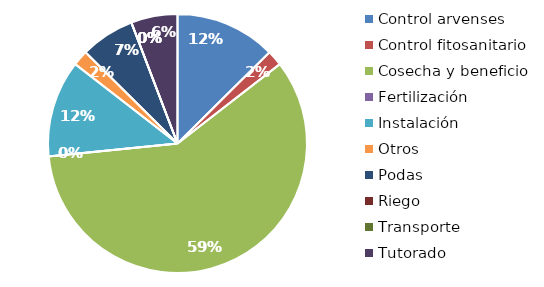
| Category | Valor |
|---|---|
| Control arvenses | 1040000 |
| Control fitosanitario | 160000 |
| Cosecha y beneficio | 4875000 |
| Fertilización | 0 |
| Instalación | 1000000 |
| Otros | 160000 |
| Podas | 560000 |
| Riego | 0 |
| Transporte | 0 |
| Tutorado | 480000 |